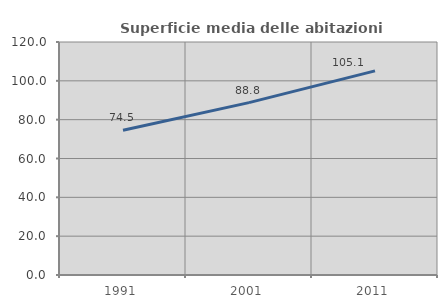
| Category | Superficie media delle abitazioni occupate |
|---|---|
| 1991.0 | 74.515 |
| 2001.0 | 88.779 |
| 2011.0 | 105.119 |